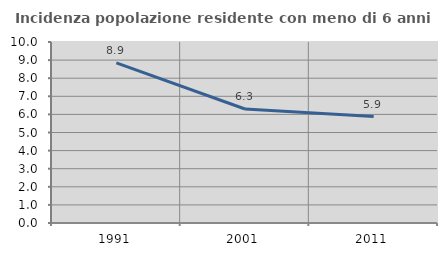
| Category | Incidenza popolazione residente con meno di 6 anni |
|---|---|
| 1991.0 | 8.851 |
| 2001.0 | 6.298 |
| 2011.0 | 5.878 |